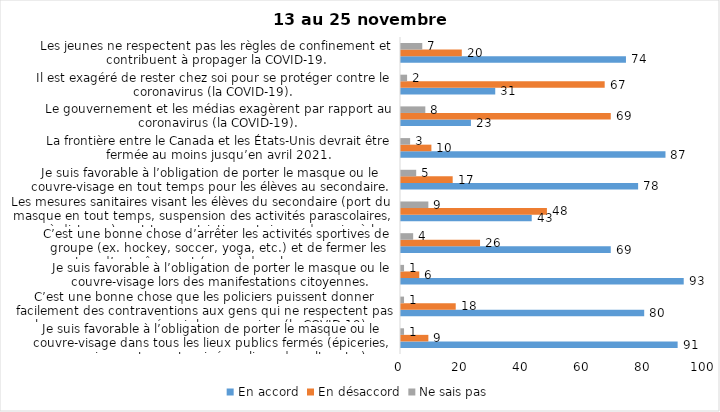
| Category | En accord | En désaccord | Ne sais pas |
|---|---|---|---|
| Je suis favorable à l’obligation de porter le masque ou le couvre-visage dans tous les lieux publics fermés (épiceries, magasins, restaurants, cinéma, lieux de culte, etc.). | 91 | 9 | 1 |
| C’est une bonne chose que les policiers puissent donner facilement des contraventions aux gens qui ne respectent pas les mesures pour prévenir le coronavirus (la COVID-19). | 80 | 18 | 1 |
| Je suis favorable à l’obligation de porter le masque ou le couvre-visage lors des manifestations citoyennes. | 93 | 6 | 1 |
| C’est une bonne chose d’arrêter les activités sportives de groupe (ex. hockey, soccer, yoga, etc.) et de fermer les centres d’entraînement (gyms) dans les zones rouges. | 69 | 26 | 4 |
| Les mesures sanitaires visant les élèves du secondaire (port du masque en tout temps, suspension des activités parascolaires, cours à distance) sont trop restrictives et risque de nuire à leur santé mentale et leur développement. | 43 | 48 | 9 |
| Je suis favorable à l’obligation de porter le masque ou le couvre-visage en tout temps pour les élèves au secondaire. | 78 | 17 | 5 |
| La frontière entre le Canada et les États-Unis devrait être fermée au moins jusqu’en avril 2021. | 87 | 10 | 3 |
| Le gouvernement et les médias exagèrent par rapport au coronavirus (la COVID-19). | 23 | 69 | 8 |
| Il est exagéré de rester chez soi pour se protéger contre le coronavirus (la COVID-19). | 31 | 67 | 2 |
| Les jeunes ne respectent pas les règles de confinement et contribuent à propager la COVID-19. | 74 | 20 | 7 |